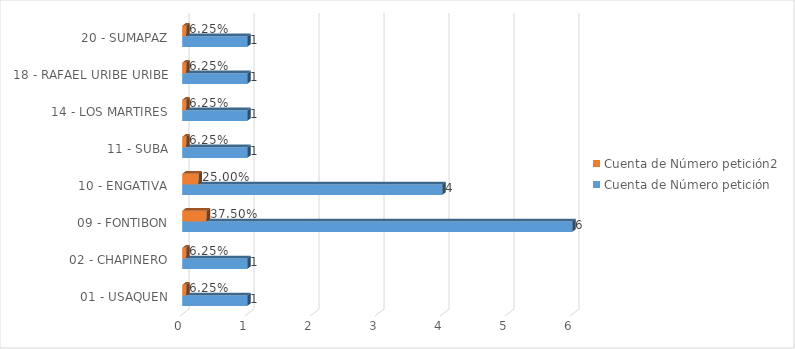
| Category | Cuenta de Número petición | Cuenta de Número petición2 |
|---|---|---|
| 01 - USAQUEN | 1 | 0.062 |
| 02 - CHAPINERO | 1 | 0.062 |
| 09 - FONTIBON | 6 | 0.375 |
| 10 - ENGATIVA | 4 | 0.25 |
| 11 - SUBA | 1 | 0.062 |
| 14 - LOS MARTIRES | 1 | 0.062 |
| 18 - RAFAEL URIBE URIBE | 1 | 0.062 |
| 20 - SUMAPAZ | 1 | 0.062 |